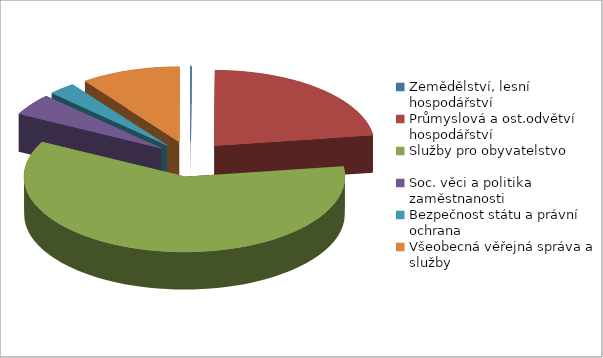
| Category | Series 0 |
|---|---|
| Zemědělství, lesní hospodářství | 1685 |
| Průmyslová a ost.odvětví hospodářství | 494028 |
| Služby pro obyvatelstvo | 1303404 |
| Soc. věci a politika zaměstnanosti | 101567 |
| Bezpečnost státu a právní ochrana | 59554 |
| Všeobecná věřejná správa a služby | 218234 |